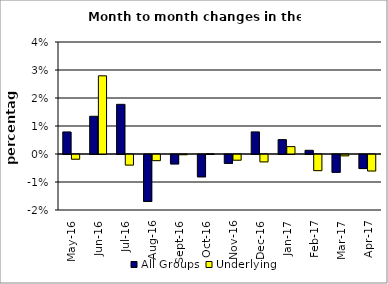
| Category | All Groups | Underlying |
|---|---|---|
| 2016-05-01 | 0.008 | -0.002 |
| 2016-06-01 | 0.013 | 0.028 |
| 2016-07-01 | 0.018 | -0.004 |
| 2016-08-01 | -0.017 | -0.002 |
| 2016-09-01 | -0.003 | 0 |
| 2016-10-01 | -0.008 | 0 |
| 2016-11-01 | -0.003 | -0.002 |
| 2016-12-01 | 0.008 | -0.003 |
| 2017-01-01 | 0.005 | 0.003 |
| 2017-02-01 | 0.001 | -0.006 |
| 2017-03-01 | -0.006 | 0 |
| 2017-04-01 | -0.005 | -0.006 |